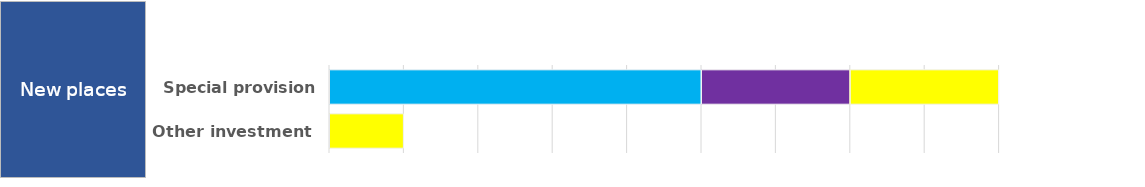
| Category | Alternative provision/PRU | Independent and non-maintained | Mainstream provision (not unit) | Special provision | Special unit or resourced provision | Other |
|---|---|---|---|---|---|---|
| Special provision fund | 0 | 0 | 10 | 4 | 4 | 0 |
| Other investment | 0 | 0 | 0 | 0 | 2 | 0 |